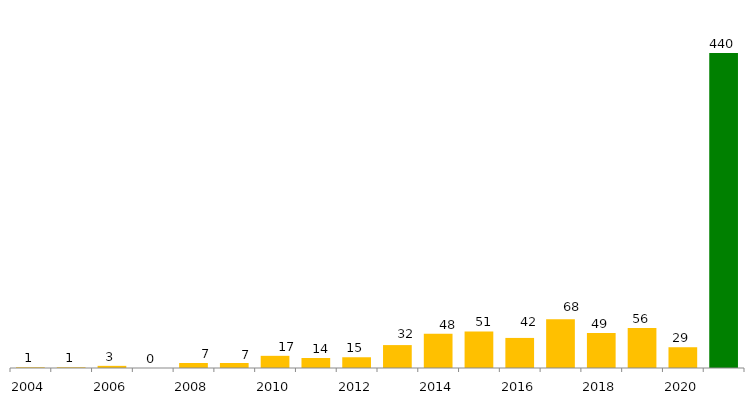
| Category | Categoria/Ano |
|---|---|
| 2004 | 1 |
| 2005 | 1 |
| 2006 | 3 |
| 2007 | 0 |
| 2008 | 7 |
| 2009 | 7 |
| 2010 | 17 |
| 2011 | 14 |
| 2012 | 15 |
| 2013 | 32 |
| 2014 | 48 |
| 2015 | 51 |
| 2016 | 42 |
| 2017 | 68 |
| 2018 | 49 |
| 2019 | 56 |
| 2020 | 29 |
| Total Geral | 440 |